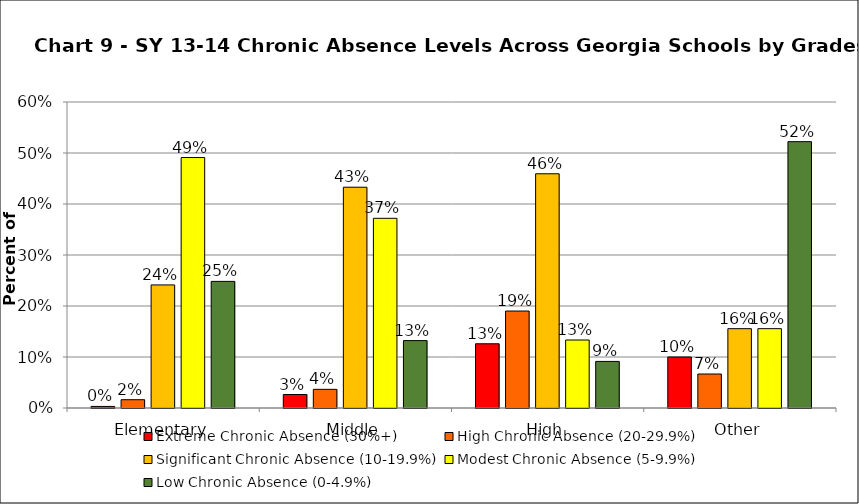
| Category | Extreme Chronic Absence (30%+) | High Chronic Absence (20-29.9%) | Significant Chronic Absence (10-19.9%) | Modest Chronic Absence (5-9.9%) | Low Chronic Absence (0-4.9%) |
|---|---|---|---|---|---|
| 0 | 0.003 | 0.016 | 0.241 | 0.491 | 0.248 |
| 1 | 0.026 | 0.037 | 0.433 | 0.372 | 0.132 |
| 2 | 0.126 | 0.19 | 0.459 | 0.133 | 0.091 |
| 3 | 0.1 | 0.067 | 0.156 | 0.156 | 0.522 |